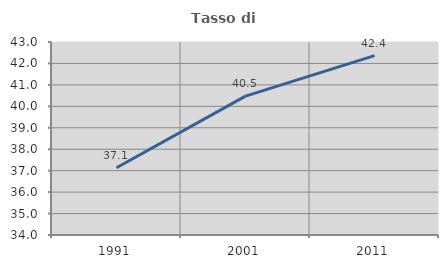
| Category | Tasso di occupazione   |
|---|---|
| 1991.0 | 37.139 |
| 2001.0 | 40.474 |
| 2011.0 | 42.366 |